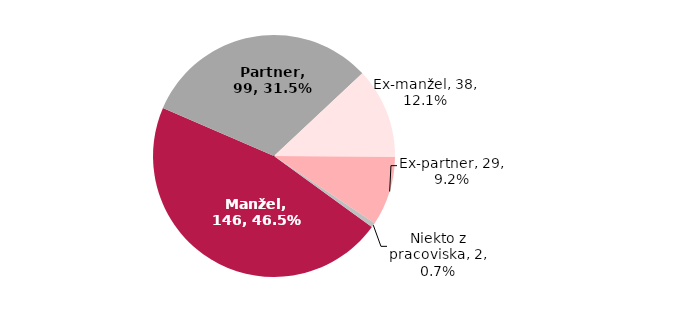
| Category | Series 0 |
|---|---|
| Manžel | 146 |
| Partner | 99 |
| Ex-manžel | 38 |
| Ex-partner | 29 |
| Niekto z pracoviska | 2 |